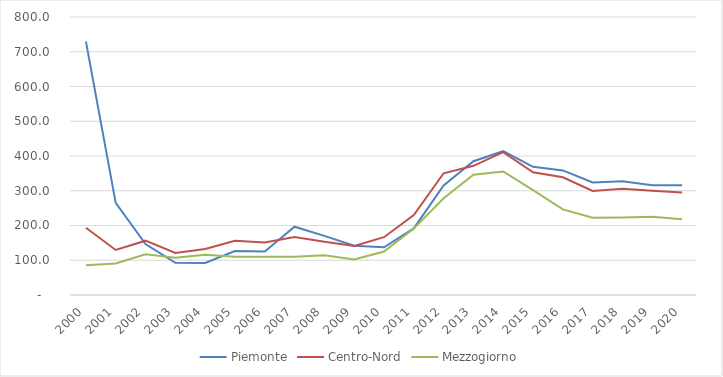
| Category | Piemonte | Centro-Nord | Mezzogiorno |
|---|---|---|---|
| 2000 | 729.945 | 193.582 | 85.708 |
| 2001 | 265.208 | 129.617 | 90.456 |
| 2002 | 146.42 | 156.334 | 117.08 |
| 2003 | 92.45 | 120.999 | 107.282 |
| 2004 | 92.149 | 132.61 | 115.737 |
| 2005 | 126.624 | 156.118 | 109.959 |
| 2006 | 125.161 | 151.054 | 109.936 |
| 2007 | 196.508 | 166.898 | 110.224 |
| 2008 | 170.124 | 153.024 | 114.408 |
| 2009 | 141.858 | 140.8 | 102.187 |
| 2010 | 137.261 | 166.324 | 124.923 |
| 2011 | 191.588 | 229.96 | 191.011 |
| 2012 | 314.966 | 350.264 | 278.262 |
| 2013 | 385.015 | 371.702 | 346.378 |
| 2014 | 413.839 | 411.313 | 355.42 |
| 2015 | 368.962 | 353.369 | 301.73 |
| 2016 | 358.592 | 338.693 | 246.208 |
| 2017 | 323.631 | 299.393 | 222.155 |
| 2018 | 327.594 | 305.857 | 223.3 |
| 2019 | 315.853 | 300.009 | 225.469 |
| 2020 | 316.043 | 295.14 | 217.68 |